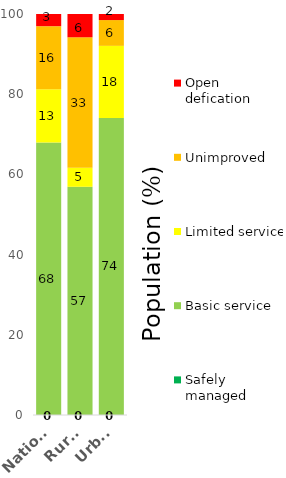
| Category | Safely managed | Basic service | Limited service | Unimproved | Open defication |
|---|---|---|---|---|---|
| National | 0 | 67.979 | 13.286 | 15.695 | 3.04 |
| Rural | 0 | 56.913 | 4.752 | 32.529 | 5.807 |
| Urban | 0 | 74.073 | 17.986 | 6.425 | 1.516 |